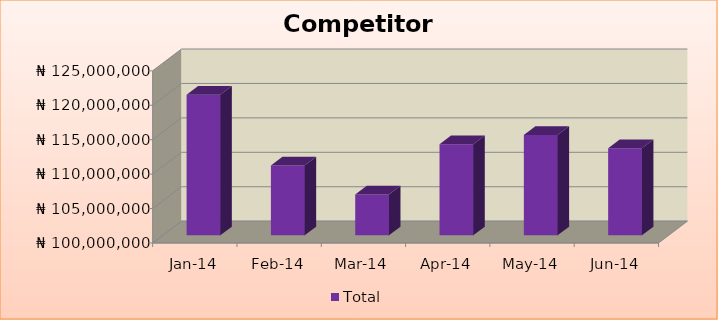
| Category | Total |
|---|---|
| 2014-01-01 | 120426000 |
| 2014-02-01 | 110136000 |
| 2014-03-01 | 105925000 |
| 2014-04-01 | 113215000 |
| 2014-05-01 | 114571000 |
| 2014-06-01 | 112652000 |